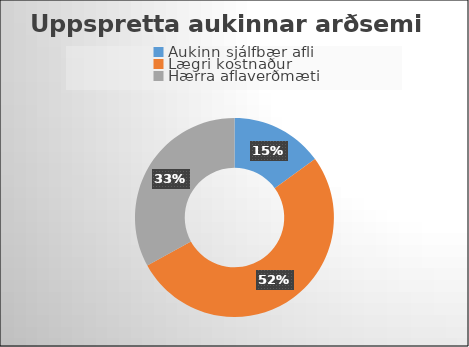
| Category | Series 0 |
|---|---|
| Aukinn sjálfbær afli | 0.15 |
| Lægri kostnaður | 0.52 |
| Hærra aflaverðmæti | 0.33 |